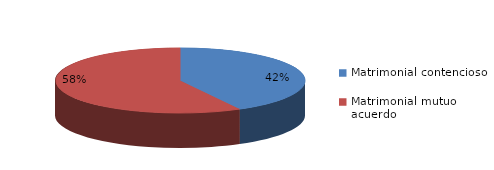
| Category | Series 0 |
|---|---|
| 0 | 493 |
| 1 | 678 |